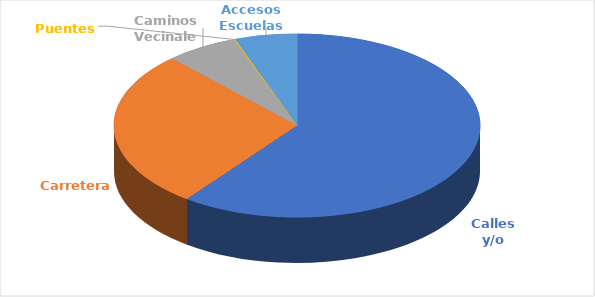
| Category | Series 0 | Series 1 |
|---|---|---|
| Calles y/o Avenidas | 117 | 439.1 |
| Carreteras | 54 | 780.77 |
| Caminos Vecinales | 12.3 | 159.54 |
| Puentes  | 0.24 | 12.83 |
| Accesos Escuelas | 10.64 | 0 |